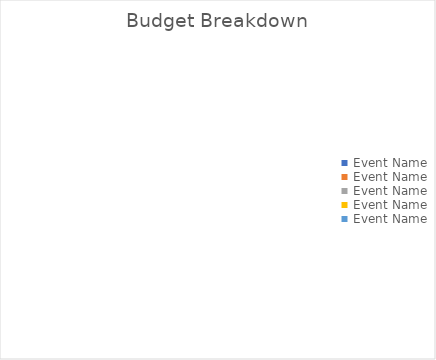
| Category | Series 0 |
|---|---|
| Event Name | 0 |
| Event Name | 0 |
| Event Name | 0 |
| Event Name | 0 |
| Event Name | 0 |